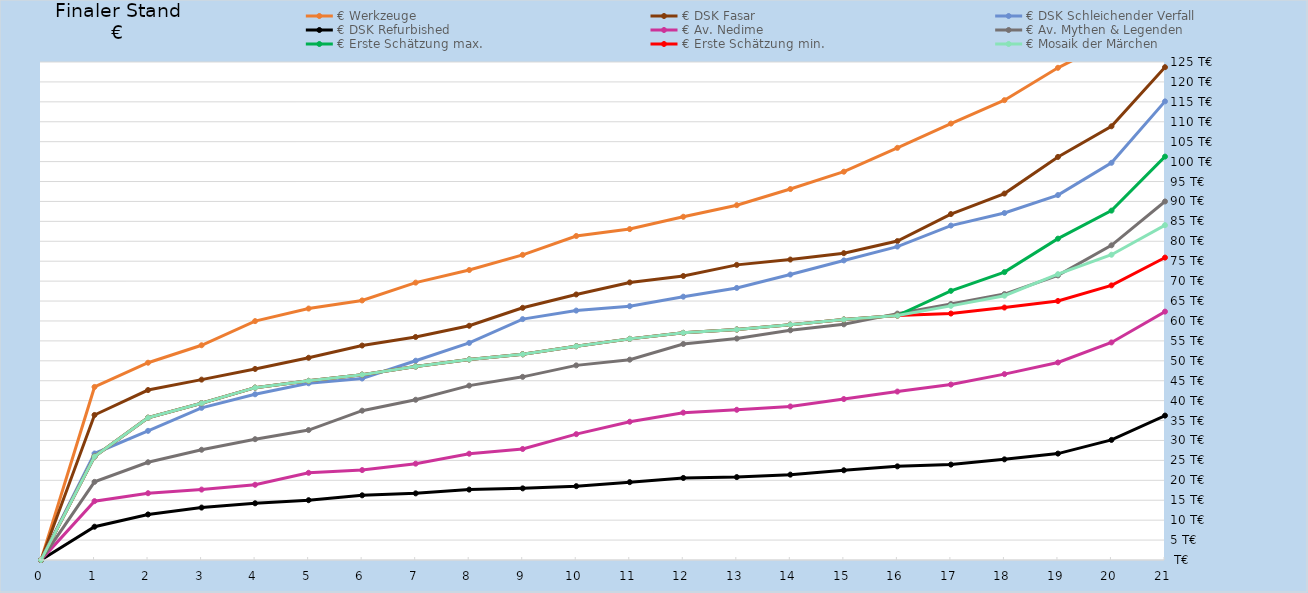
| Category | € Thorwal | € Werkzeuge | € Sonnenküste | € Rohals Erben | € Winterwacht | € DSK Fasar | € DSK Schleichender Verfall | € DSK Refurbished | € Av. Nedime | € Av. Mythen & Legenden | € Erste Schätzung max. | € Erste Schätzung min. | € Mosaik der Märchen |
|---|---|---|---|---|---|---|---|---|---|---|---|---|---|
| 0.0 |  | 0 |  |  |  | 0 | 0 | 0 | 0 | 0 | 0 | 0 | 0 |
| 1.0 |  | 43437 |  |  |  | 36402 | 26725 | 8357 | 14771 | 19612 | 25960 | 25960 | 25960 |
| 2.0 |  | 49522 |  |  |  | 42659 | 32416 | 11433 | 16764 | 24532 | 35712 | 35712 | 35712 |
| 3.0 |  | 53901 |  |  |  | 45273 | 38191 | 13158 | 17674 | 27671 | 39341 | 39341 | 39341 |
| 4.0 |  | 59963 |  |  |  | 47957 | 41597 | 14235 | 18881 | 30324 | 43256 | 43256 | 43256 |
| 5.0 |  | 63115 |  |  |  | 50763 | 44358 | 15015 | 21886 | 32621 | 44966 | 44966 | 44966 |
| 6.0 |  | 65148 |  |  |  | 53829 | 45558 | 16237 | 22571 | 37481 | 46520 | 46520 | 46520 |
| 7.0 |  | 69623 |  |  |  | 55981 | 50019 | 16727 | 24180 | 40223 | 48572 | 48572 | 48572 |
| 8.0 |  | 72783 |  |  |  | 58795 | 54482 | 17672 | 26679 | 43766 | 50335 | 50335 | 50335 |
| 9.0 |  | 76597 |  |  |  | 63300 | 60464 | 17982 | 27868 | 45971 | 51635 | 51635 | 51635 |
| 10.0 |  | 81327 |  |  |  | 66650 | 62608 | 18530 | 31587 | 48853 | 53657 | 53657 | 53657 |
| 11.0 |  | 83062 |  |  |  | 69668 | 63707 | 19542 | 34703 | 50284 | 55502 | 55502 | 55502 |
| 12.0 |  | 86154 |  |  |  | 71286 | 66094 | 20594 | 36986 | 54218 | 57013 | 57013 | 57013 |
| 13.0 |  | 89062 |  |  |  | 74079 | 68288 | 20809 | 37704 | 55585 | 57853 | 57853 | 57853 |
| 14.0 |  | 93109 |  |  |  | 75411 | 71648 | 21426 | 38541 | 57658 | 59064 | 59064 | 59064 |
| 15.0 |  | 97466 |  |  |  | 77016 | 75191 | 22523 | 40401 | 59154 | 60362 | 60362 | 60362 |
| 16.0 |  | 103452 |  |  |  | 80049 | 78668 | 23503 | 42277 | 61842 | 61360 | 61360 | 61360 |
| 17.0 |  | 109547 |  |  |  | 86833 | 83940 | 23945 | 44039 | 64258 | 67559.885 | 61864.435 | 63787 |
| 18.0 |  | 115420 |  |  |  | 91974 | 87091 | 25263 | 46661 | 66749 | 72258.235 | 63368.612 | 66341 |
| 19.0 |  | 123542 |  |  |  | 101170 | 91598 | 26708 | 49576 | 71433 | 80662.443 | 65017.727 | 71736 |
| 20.0 |  | 130324 |  |  |  | 108862 | 99702 | 30138 | 54612 | 78993 | 87692.147 | 68932.237 | 76619 |
| 21.0 |  | 170701 |  |  |  | 123694 | 115113 | 36248 | 62345 | 89991 | 101247.084 | 75905.315 | 84047 |